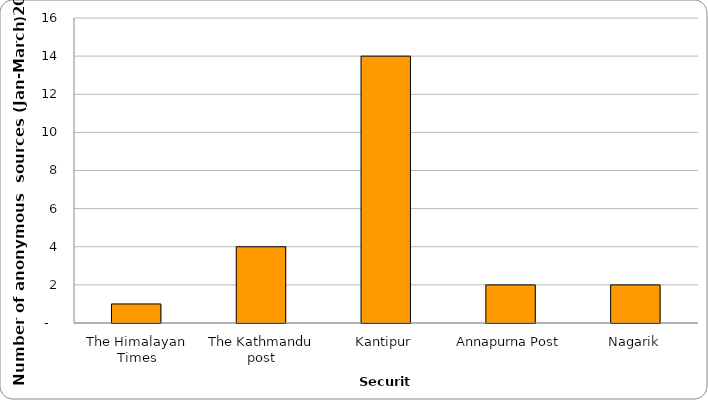
| Category | Security |
|---|---|
| The Himalayan Times | 1 |
| The Kathmandu post | 4 |
| Kantipur | 14 |
| Annapurna Post | 2 |
| Nagarik | 2 |